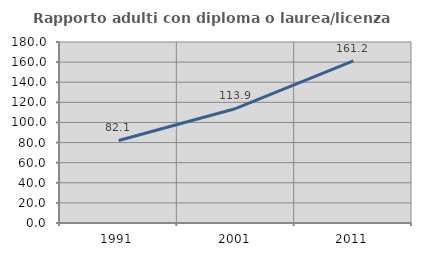
| Category | Rapporto adulti con diploma o laurea/licenza media  |
|---|---|
| 1991.0 | 82.063 |
| 2001.0 | 113.928 |
| 2011.0 | 161.204 |